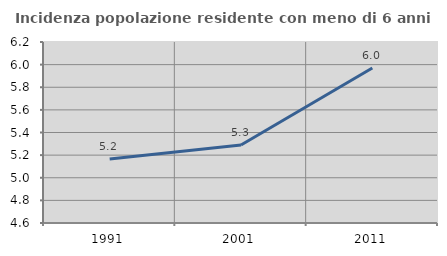
| Category | Incidenza popolazione residente con meno di 6 anni |
|---|---|
| 1991.0 | 5.165 |
| 2001.0 | 5.29 |
| 2011.0 | 5.97 |